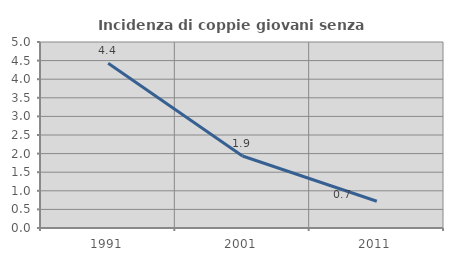
| Category | Incidenza di coppie giovani senza figli |
|---|---|
| 1991.0 | 4.43 |
| 2001.0 | 1.935 |
| 2011.0 | 0.719 |